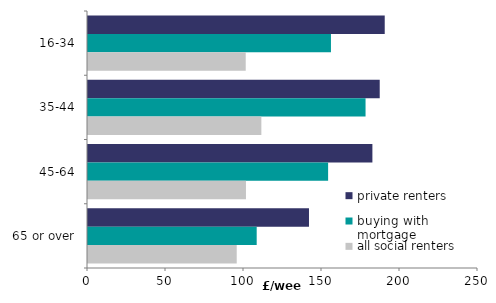
| Category | private renters | buying with mortgage | all social renters   |
|---|---|---|---|
| 16-34 | 190.21 | 155.744 | 101.104 |
| 35-44 | 187.002 | 177.916 | 111.128 |
| 45-64 | 182.306 | 153.92 | 101.263 |
| 65 or over | 141.657 | 108.137 | 95.336 |